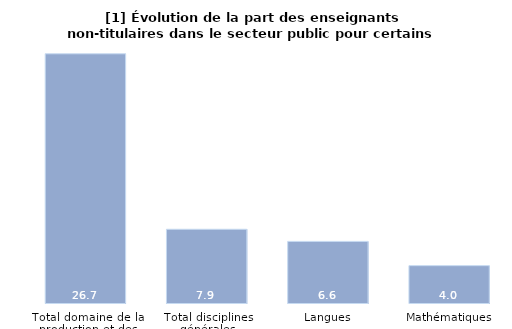
| Category | Series 1 |
|---|---|
| Total domaine de la production et des services | 26.7 |
| Total disciplines générales | 7.9 |
| Langues | 6.6 |
| Mathématiques | 4 |